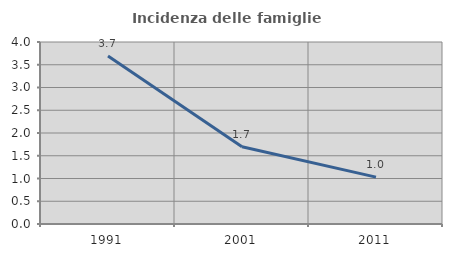
| Category | Incidenza delle famiglie numerose |
|---|---|
| 1991.0 | 3.691 |
| 2001.0 | 1.698 |
| 2011.0 | 1.03 |